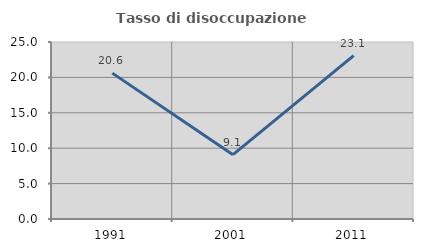
| Category | Tasso di disoccupazione giovanile  |
|---|---|
| 1991.0 | 20.603 |
| 2001.0 | 9.091 |
| 2011.0 | 23.077 |